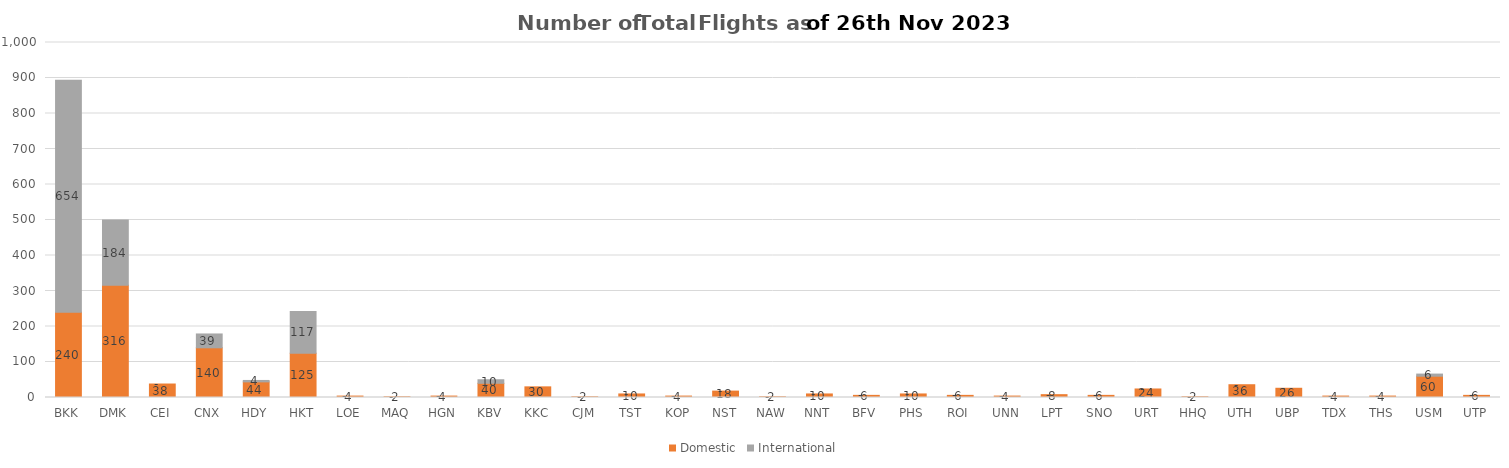
| Category | Domestic | International |
|---|---|---|
| BKK | 240 | 654 |
| DMK | 316 | 184 |
| CEI | 38 | 0 |
| CNX | 140 | 39 |
| HDY | 44 | 4 |
| HKT | 125 | 117 |
| LOE | 4 | 0 |
| MAQ | 2 | 0 |
| HGN | 4 | 0 |
| KBV | 40 | 10 |
| KKC | 30 | 0 |
| CJM | 2 | 0 |
| TST | 10 | 0 |
| KOP | 4 | 0 |
| NST | 18 | 0 |
| NAW | 2 | 0 |
| NNT | 10 | 0 |
| BFV | 6 | 0 |
| PHS | 10 | 0 |
| ROI | 6 | 0 |
| UNN | 4 | 0 |
| LPT | 8 | 0 |
| SNO | 6 | 0 |
| URT | 24 | 0 |
| HHQ | 2 | 0 |
| UTH | 36 | 0 |
| UBP | 26 | 0 |
| TDX | 4 | 0 |
| THS | 4 | 0 |
| USM | 60 | 6 |
| UTP | 6 | 0 |